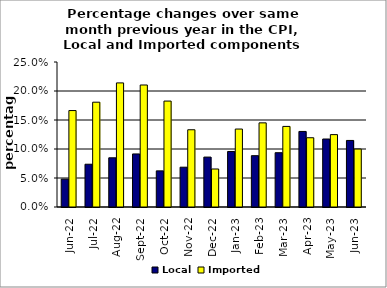
| Category | Local | Imported |
|---|---|---|
| 2022-06-01 | 0.048 | 0.166 |
| 2022-07-01 | 0.074 | 0.181 |
| 2022-08-01 | 0.085 | 0.214 |
| 2022-09-01 | 0.091 | 0.21 |
| 2022-10-01 | 0.062 | 0.183 |
| 2022-11-01 | 0.069 | 0.133 |
| 2022-12-01 | 0.086 | 0.066 |
| 2023-01-01 | 0.096 | 0.134 |
| 2023-02-01 | 0.088 | 0.145 |
| 2023-03-01 | 0.094 | 0.139 |
| 2023-04-01 | 0.13 | 0.119 |
| 2023-05-01 | 0.117 | 0.125 |
| 2023-06-01 | 0.115 | 0.1 |